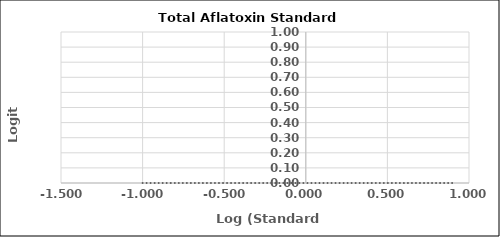
| Category | Series 0 |
|---|---|
| -1.0 | 0 |
| -0.6020599913279624 | 0 |
| -0.09691001300805639 | 0 |
| 0.3979400086720376 | 0 |
| 0.9030899869919435 | 0 |